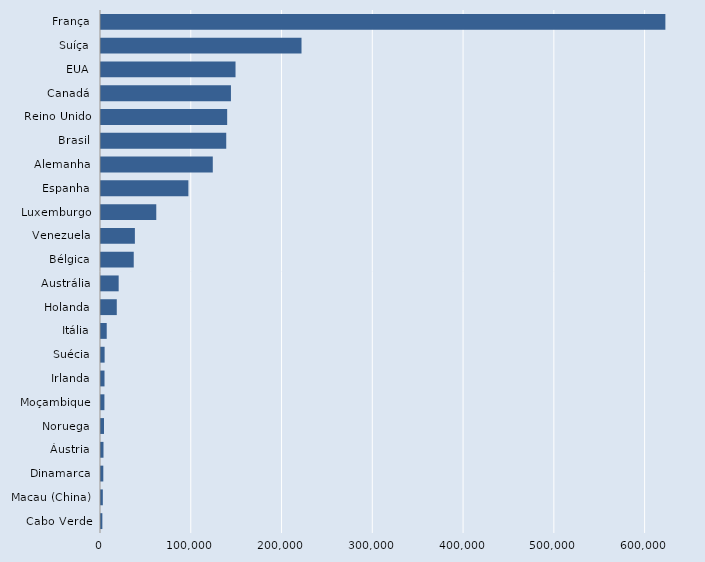
| Category | Series 0 |
|---|---|
| Cabo Verde | 1491 |
| Macau (China) | 2011 |
| Dinamarca | 2541 |
| Áustria | 2735 |
| Noruega | 3320 |
| Moçambique | 3767 |
| Irlanda | 3866 |
| Suécia | 3983 |
| Itália | 6305 |
| Holanda | 17384 |
| Austrália | 19460 |
| Bélgica | 36074 |
| Venezuela | 37326 |
| Luxemburgo | 60897 |
| Espanha | 96266 |
| Alemanha | 123155 |
| Brasil | 137973 |
| Reino Unido | 139000 |
| Canadá | 143160 |
| EUA | 148208 |
| Suíça | 220904 |
| França | 621777 |